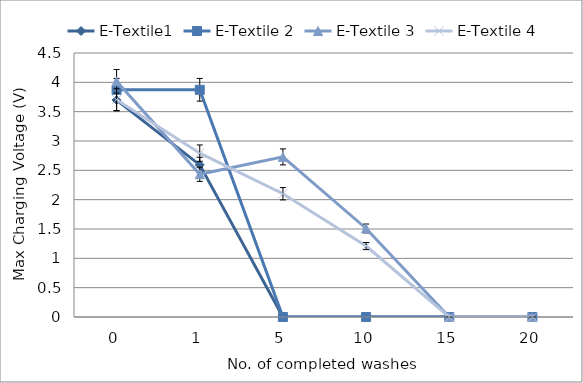
| Category | E-Textile1 | E-Textile 2 | E-Textile 3 | E-Textile 4 |
|---|---|---|---|---|
| 0.0 | 3.697 | 3.873 | 4.017 | 3.705 |
| 1.0 | 2.593 | 3.873 | 2.433 | 2.793 |
| 5.0 | 0 | 0 | 2.729 | 2.101 |
| 10.0 | 0 | 0 | 1.509 | 1.209 |
| 15.0 | 0 | 0 | 0 | 0 |
| 20.0 | 0 | 0 | 0 | 0 |